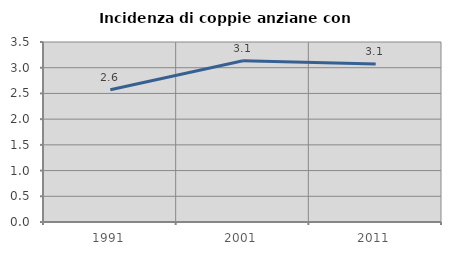
| Category | Incidenza di coppie anziane con figli |
|---|---|
| 1991.0 | 2.573 |
| 2001.0 | 3.137 |
| 2011.0 | 3.07 |